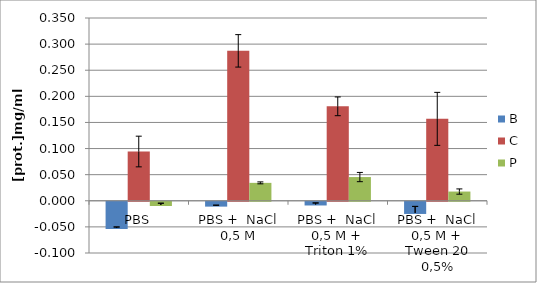
| Category | B | C | P |
|---|---|---|---|
| PBS | -0.052 | 0.094 | -0.008 |
| PBS +  NaCl 0,5 M | -0.009 | 0.287 | 0.034 |
| PBS +  NaCl 0,5 M + Triton 1% | -0.007 | 0.181 | 0.045 |
| PBS +  NaCl 0,5 M + Tween 20 0,5% | -0.023 | 0.157 | 0.018 |